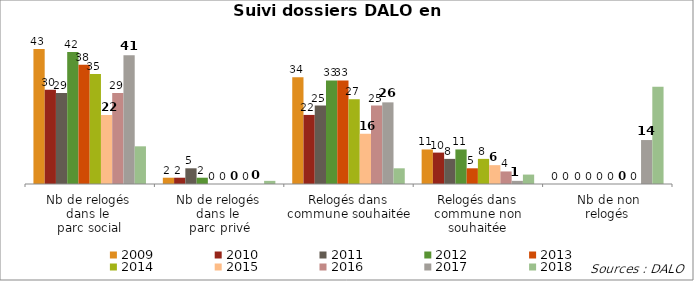
| Category | 2009 | 2010 | 2011 | 2012 | 2013 | 2014 | 2015 | 2016 | 2017 | 2018 |
|---|---|---|---|---|---|---|---|---|---|---|
| Nb de relogés 
dans le 
parc social | 43 | 30 | 29 | 42 | 38 | 35 | 22 | 29 | 41 | 12 |
| Nb de relogés 
dans le 
parc privé | 2 | 2 | 5 | 2 | 0 | 0 | 0 | 0 | 0 | 1 |
| Relogés dans commune souhaitée | 34 | 22 | 25 | 33 | 33 | 27 | 16 | 25 | 26 | 5 |
| Relogés dans commune non souhaitée | 11 | 10 | 8 | 11 | 5 | 8 | 6 | 4 | 1 | 3 |
| Nb de non
relogés | 0 | 0 | 0 | 0 | 0 | 0 | 0 | 0 | 14 | 31 |